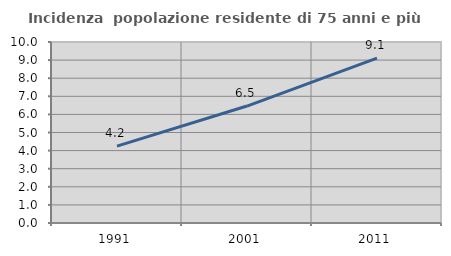
| Category | Incidenza  popolazione residente di 75 anni e più |
|---|---|
| 1991.0 | 4.25 |
| 2001.0 | 6.462 |
| 2011.0 | 9.106 |